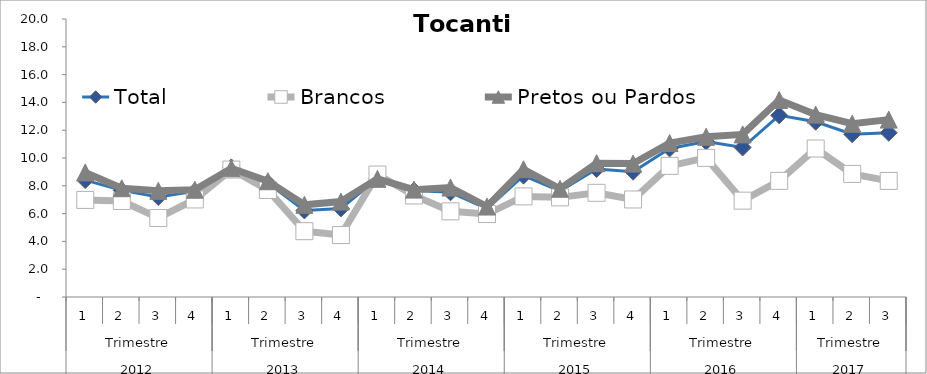
| Category | Total | Brancos | Pretos ou Pardos |
|---|---|---|---|
| 0 | 8.407 | 6.983 | 8.962 |
| 1 | 7.671 | 6.908 | 7.827 |
| 2 | 7.193 | 5.685 | 7.637 |
| 3 | 7.597 | 7.019 | 7.716 |
| 4 | 9.324 | 9.169 | 9.261 |
| 5 | 8.203 | 7.698 | 8.331 |
| 6 | 6.226 | 4.736 | 6.633 |
| 7 | 6.371 | 4.455 | 6.864 |
| 8 | 8.517 | 8.809 | 8.499 |
| 9 | 7.654 | 7.306 | 7.725 |
| 10 | 7.532 | 6.163 | 7.872 |
| 11 | 6.348 | 5.967 | 6.506 |
| 12 | 8.728 | 7.237 | 9.189 |
| 13 | 7.627 | 7.169 | 7.786 |
| 14 | 9.203 | 7.494 | 9.623 |
| 15 | 9.017 | 7.016 | 9.599 |
| 16 | 10.687 | 9.434 | 11.074 |
| 17 | 11.181 | 10.009 | 11.525 |
| 18 | 10.754 | 6.932 | 11.697 |
| 19 | 13.067 | 8.355 | 14.175 |
| 20 | 12.607 | 10.682 | 13.122 |
| 21 | 11.71 | 8.855 | 12.468 |
| 22 | 11.816 | 8.35 | 12.761 |